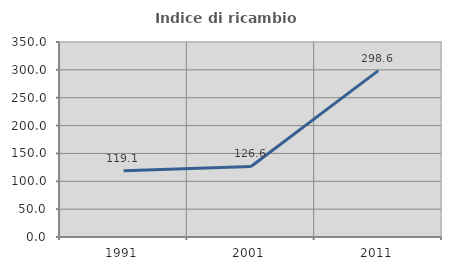
| Category | Indice di ricambio occupazionale  |
|---|---|
| 1991.0 | 119.128 |
| 2001.0 | 126.591 |
| 2011.0 | 298.638 |